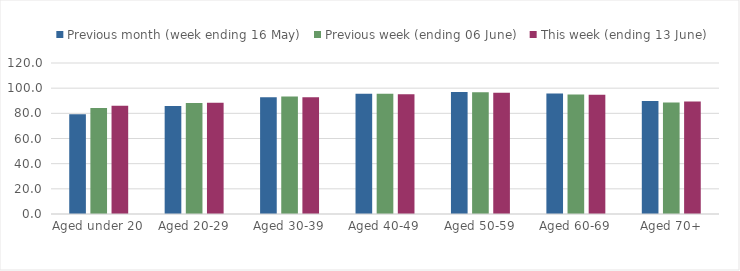
| Category | Previous month (week ending 16 May) | Previous week (ending 06 June) | This week (ending 13 June) |
|---|---|---|---|
| Aged under 20 | 79.299 | 84.295 | 86.059 |
| Aged 20-29 | 85.823 | 88.218 | 88.339 |
| Aged 30-39 | 92.866 | 93.333 | 92.827 |
| Aged 40-49 | 95.626 | 95.529 | 95.119 |
| Aged 50-59 | 97.052 | 96.687 | 96.356 |
| Aged 60-69 | 95.705 | 95.041 | 94.785 |
| Aged 70+ | 89.88 | 88.583 | 89.499 |